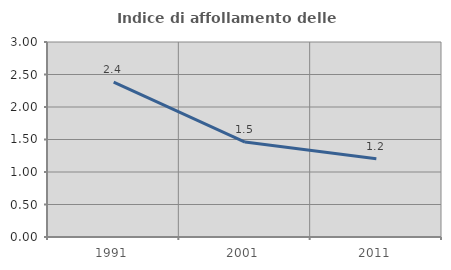
| Category | Indice di affollamento delle abitazioni  |
|---|---|
| 1991.0 | 2.382 |
| 2001.0 | 1.46 |
| 2011.0 | 1.203 |